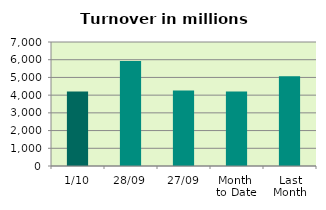
| Category | Series 0 |
|---|---|
| 1/10 | 4207.749 |
| 28/09 | 5926.68 |
| 27/09 | 4267.223 |
| Month 
to Date | 4207.749 |
| Last
Month | 5068.328 |